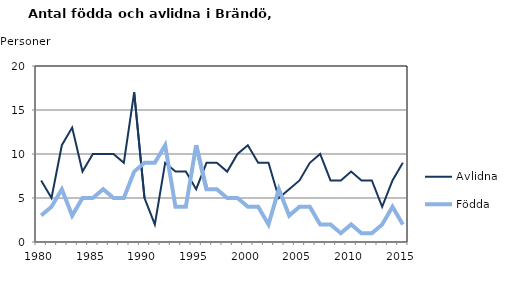
| Category | Avlidna | Födda |
|---|---|---|
| 1980.0 | 7 | 3 |
| 1981.0 | 5 | 4 |
| 1982.0 | 11 | 6 |
| 1983.0 | 13 | 3 |
| 1984.0 | 8 | 5 |
| 1985.0 | 10 | 5 |
| 1986.0 | 10 | 6 |
| 1987.0 | 10 | 5 |
| 1988.0 | 9 | 5 |
| 1989.0 | 17 | 8 |
| 1990.0 | 5 | 9 |
| 1991.0 | 2 | 9 |
| 1992.0 | 9 | 11 |
| 1993.0 | 8 | 4 |
| 1994.0 | 8 | 4 |
| 1995.0 | 6 | 11 |
| 1996.0 | 9 | 6 |
| 1997.0 | 9 | 6 |
| 1998.0 | 8 | 5 |
| 1999.0 | 10 | 5 |
| 2000.0 | 11 | 4 |
| 2001.0 | 9 | 4 |
| 2002.0 | 9 | 2 |
| 2003.0 | 5 | 6 |
| 2004.0 | 6 | 3 |
| 2005.0 | 7 | 4 |
| 2006.0 | 9 | 4 |
| 2007.0 | 10 | 2 |
| 2008.0 | 7 | 2 |
| 2009.0 | 7 | 1 |
| 2010.0 | 8 | 2 |
| 2011.0 | 7 | 1 |
| 2012.0 | 7 | 1 |
| 2013.0 | 4 | 2 |
| 2014.0 | 7 | 4 |
| 2015.0 | 9 | 2 |